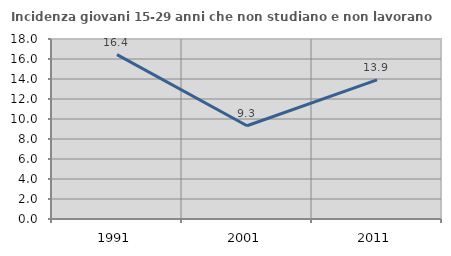
| Category | Incidenza giovani 15-29 anni che non studiano e non lavorano  |
|---|---|
| 1991.0 | 16.441 |
| 2001.0 | 9.324 |
| 2011.0 | 13.918 |